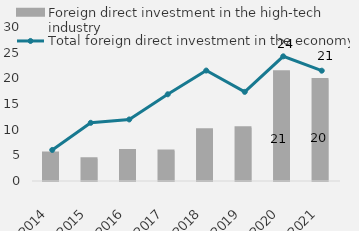
| Category | Foreign direct investment in the high-tech industry |
|---|---|
| 2014.0 | 5434 |
| 2015.0 | 4343 |
| 2016.0 | 5965 |
| 2017.0 | 5865 |
| 2018.0 | 9986 |
| 2019.0 | 10374 |
| 2020.0 | 21275 |
| 2021.0 | 19759 |